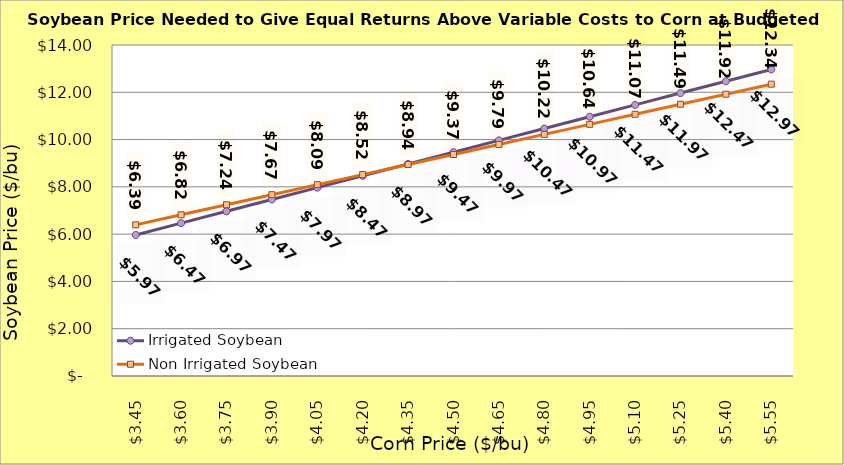
| Category | Irrigated Soybean | Non Irrigated Soybean |
|---|---|---|
| 3.4499999999999993 | 5.967 | 6.393 |
| 3.599999999999999 | 6.467 | 6.818 |
| 3.749999999999999 | 6.967 | 7.243 |
| 3.899999999999999 | 7.467 | 7.668 |
| 4.049999999999999 | 7.967 | 8.093 |
| 4.199999999999999 | 8.467 | 8.518 |
| 4.35 | 8.967 | 8.943 |
| 4.5 | 9.467 | 9.368 |
| 4.65 | 9.967 | 9.793 |
| 4.800000000000001 | 10.467 | 10.218 |
| 4.950000000000001 | 10.967 | 10.643 |
| 5.100000000000001 | 11.467 | 11.068 |
| 5.250000000000002 | 11.967 | 11.493 |
| 5.400000000000002 | 12.467 | 11.918 |
| 5.5500000000000025 | 12.967 | 12.343 |